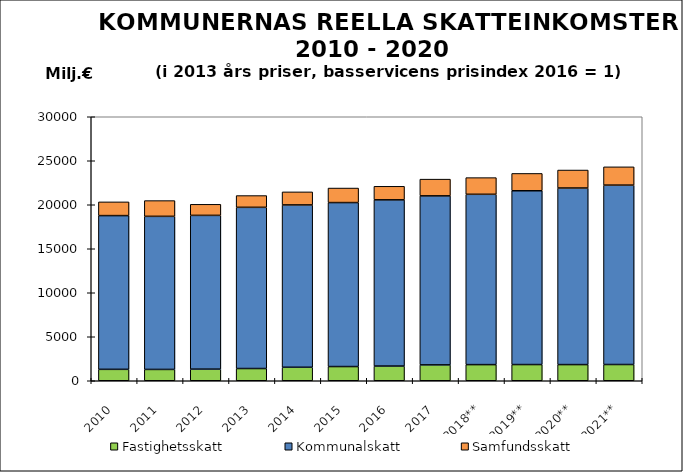
| Category | Fastighetsskatt | Kommunalskatt | Samfundsskatt |
|---|---|---|---|
| 2010 | 1296.352 | 17470.608 | 1559.108 |
| 2011 | 1285.841 | 17398.198 | 1789.548 |
| 2012 | 1317.524 | 17476.044 | 1257.689 |
| 2013 | 1389.588 | 18317.532 | 1337.058 |
| 2014 | 1532.817 | 18447.864 | 1481.581 |
| 2015 | 1613.607 | 18634.72 | 1651.359 |
| 2016 | 1669.703 | 18890.563 | 1537.872 |
| 2017 | 1802.836 | 19209.143 | 1898.989 |
| 2018** | 1833.713 | 19354.612 | 1894.165 |
| 2019** | 1839.714 | 19749.573 | 1968.991 |
| 2020** | 1837.488 | 20065.765 | 2042.74 |
| 2021** | 1846.233 | 20385.493 | 2077.012 |